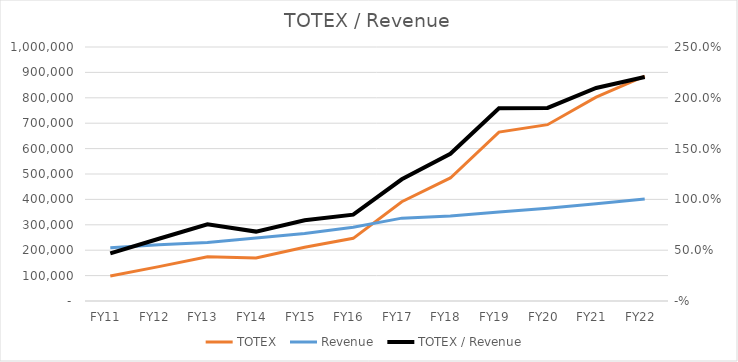
| Category | TOTEX | Revenue |
|---|---|---|
| FY11  | 98199.808 | 209591.43 |
| FY12  | 135393.728 | 220985.743 |
| FY13  | 173870.162 | 230429.261 |
| FY14  | 169416.473 | 247989.841 |
| FY15  | 211462.219 | 265855.45 |
| FY16  | 246748.802 | 290471.114 |
| FY17  | 390661.297 | 326213.149 |
| FY18  | 484372.092 | 334356.494 |
| FY19  | 665103.525 | 350536.807 |
| FY20  | 694167.589 | 365276.666 |
| FY21  | 802524.422 | 382692.168 |
| FY22  | 885775.188 | 401785.618 |